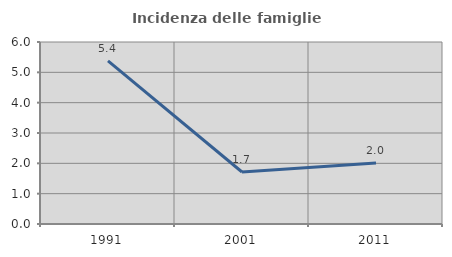
| Category | Incidenza delle famiglie numerose |
|---|---|
| 1991.0 | 5.376 |
| 2001.0 | 1.714 |
| 2011.0 | 2.013 |